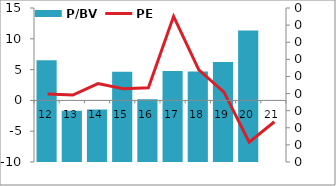
| Category | P/BV |
|---|---|
| 2012-03-31 | 0.297 |
| 2013-03-31 | 0.15 |
| 2014-03-31 | 0.153 |
| 2015-03-31 | 0.264 |
| 2016-03-31 | 0.183 |
| 2017-03-31 | 0.266 |
| 2018-03-31 | 0.264 |
| 2019-03-31 | 0.292 |
| 2020-03-31 | 0.385 |
| 2021-03-31 | 0 |